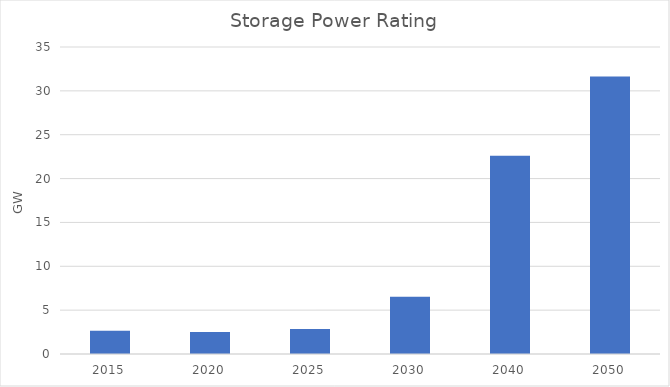
| Category | Series 0 |
|---|---|
| 2015.0 | 2.66 |
| 2020.0 | 2.52 |
| 2025.0 | 2.836 |
| 2030.0 | 6.526 |
| 2040.0 | 22.607 |
| 2050.0 | 31.637 |